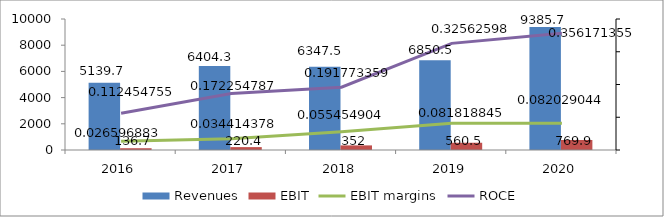
| Category | Revenues | EBIT |
|---|---|---|
| 2016.0 | 5139.7 | 136.7 |
| 2017.0 | 6404.3 | 220.4 |
| 2018.0 | 6347.5 | 352 |
| 2019.0 | 6850.5 | 560.5 |
| 2020.0 | 9385.7 | 769.9 |